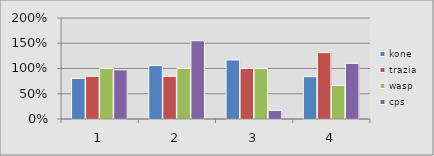
| Category | kone | trazia | wasp | cps |
|---|---|---|---|---|
| 0 | 0.802 | 0.845 | 1 | 0.974 |
| 1 | 1.058 | 0.845 | 1 | 1.55 |
| 2 | 1.169 | 1 | 1 | 0.17 |
| 3 | 0.838 | 1.314 | 0.667 | 1.103 |